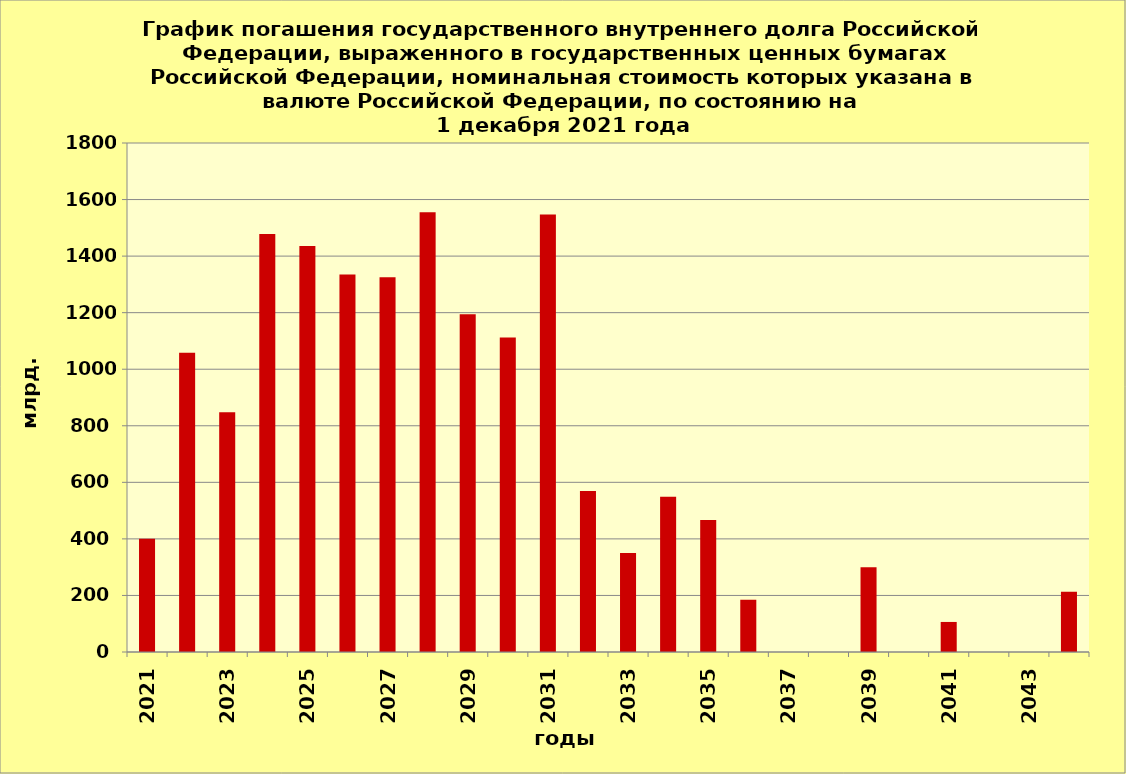
| Category | ряд 1 |
|---|---|
| 2021.0 | 400.25 |
| 2022.0 | 1058.009 |
| 2023.0 | 847.851 |
| 2024.0 | 1477.923 |
| 2025.0 | 1435.907 |
| 2026.0 | 1334.561 |
| 2027.0 | 1324.833 |
| 2028.0 | 1555.203 |
| 2029.0 | 1194.638 |
| 2030.0 | 1111.87 |
| 2031.0 | 1546.903 |
| 2032.0 | 569.258 |
| 2033.0 | 350 |
| 2034.0 | 548.84 |
| 2035.0 | 467.105 |
| 2036.0 | 184.372 |
| 2037.0 | 0 |
| 2038.0 | 0 |
| 2039.0 | 300 |
| 2040.0 | 0 |
| 2041.0 | 106.269 |
| 2042.0 | 0 |
| 2043.0 | 0 |
| 2044.0 | 212.636 |